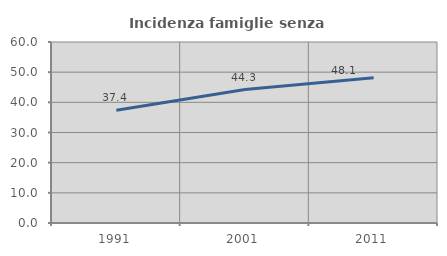
| Category | Incidenza famiglie senza nuclei |
|---|---|
| 1991.0 | 37.363 |
| 2001.0 | 44.253 |
| 2011.0 | 48.125 |